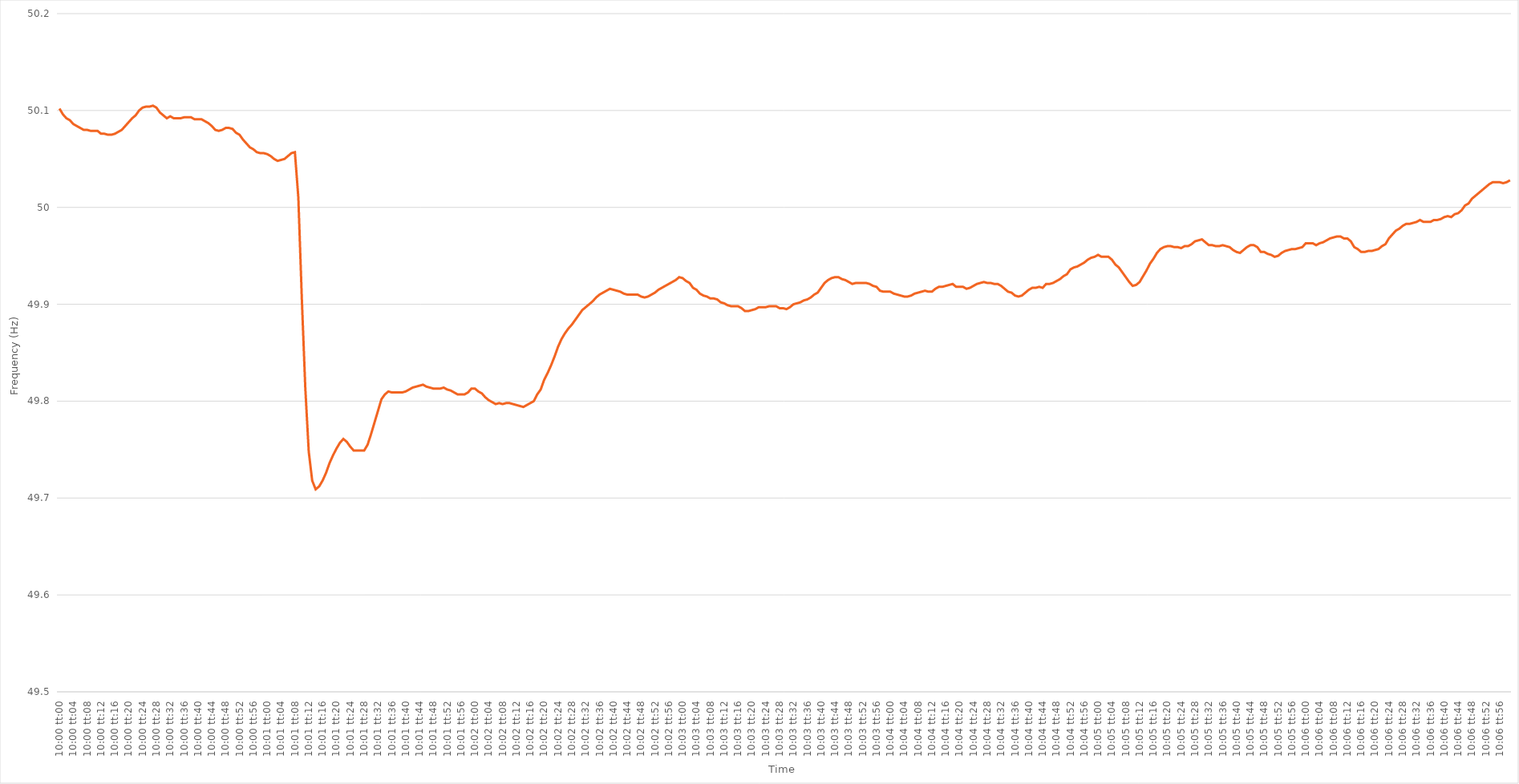
| Category | Series 0 |
|---|---|
| 0.4166666666666667 | 50.102 |
| 0.4166782407407407 | 50.096 |
| 0.4166898148148148 | 50.092 |
| 0.41670138888888886 | 50.09 |
| 0.41671296296296295 | 50.086 |
| 0.416724537037037 | 50.084 |
| 0.41673611111111114 | 50.082 |
| 0.4167476851851852 | 50.08 |
| 0.4167592592592593 | 50.08 |
| 0.4167708333333333 | 50.079 |
| 0.4167824074074074 | 50.079 |
| 0.41679398148148145 | 50.079 |
| 0.4168055555555556 | 50.076 |
| 0.41681712962962963 | 50.076 |
| 0.41682870370370373 | 50.075 |
| 0.41684027777777777 | 50.075 |
| 0.41685185185185186 | 50.076 |
| 0.4168634259259259 | 50.078 |
| 0.41687500000000005 | 50.08 |
| 0.4168865740740741 | 50.084 |
| 0.4168981481481482 | 50.088 |
| 0.4169097222222222 | 50.092 |
| 0.41692129629629626 | 50.095 |
| 0.41693287037037036 | 50.1 |
| 0.4169444444444444 | 50.103 |
| 0.41695601851851855 | 50.104 |
| 0.4169675925925926 | 50.104 |
| 0.4169791666666667 | 50.105 |
| 0.4169907407407407 | 50.103 |
| 0.4170023148148148 | 50.098 |
| 0.41701388888888885 | 50.095 |
| 0.417025462962963 | 50.092 |
| 0.41703703703703704 | 50.094 |
| 0.41704861111111113 | 50.092 |
| 0.4170601851851852 | 50.092 |
| 0.41707175925925927 | 50.092 |
| 0.4170833333333333 | 50.093 |
| 0.41709490740740746 | 50.093 |
| 0.4171064814814815 | 50.093 |
| 0.4171180555555556 | 50.091 |
| 0.41712962962962963 | 50.091 |
| 0.41714120370370367 | 50.091 |
| 0.41715277777777776 | 50.089 |
| 0.4171643518518518 | 50.087 |
| 0.41717592592592595 | 50.084 |
| 0.4171875 | 50.08 |
| 0.4171990740740741 | 50.079 |
| 0.4172106481481481 | 50.08 |
| 0.4172222222222222 | 50.082 |
| 0.41723379629629626 | 50.082 |
| 0.4172453703703704 | 50.081 |
| 0.41725694444444444 | 50.077 |
| 0.41726851851851854 | 50.075 |
| 0.4172800925925926 | 50.07 |
| 0.41729166666666667 | 50.066 |
| 0.4173032407407407 | 50.062 |
| 0.41731481481481486 | 50.06 |
| 0.4173263888888889 | 50.057 |
| 0.417337962962963 | 50.056 |
| 0.41734953703703703 | 50.056 |
| 0.4173611111111111 | 50.055 |
| 0.41737268518518517 | 50.053 |
| 0.4173842592592592 | 50.05 |
| 0.41739583333333335 | 50.048 |
| 0.4174074074074074 | 50.049 |
| 0.4174189814814815 | 50.05 |
| 0.4174305555555555 | 50.053 |
| 0.4174421296296296 | 50.056 |
| 0.41745370370370366 | 50.057 |
| 0.4174652777777778 | 50.01 |
| 0.41747685185185185 | 49.906 |
| 0.41748842592592594 | 49.814 |
| 0.4175 | 49.748 |
| 0.4175115740740741 | 49.718 |
| 0.4175231481481481 | 49.709 |
| 0.41753472222222227 | 49.712 |
| 0.4175462962962963 | 49.718 |
| 0.4175578703703704 | 49.726 |
| 0.41756944444444444 | 49.736 |
| 0.41758101851851853 | 49.744 |
| 0.41759259259259257 | 49.751 |
| 0.4176041666666667 | 49.757 |
| 0.41761574074074076 | 49.761 |
| 0.4176273148148148 | 49.758 |
| 0.4176388888888889 | 49.753 |
| 0.41765046296296293 | 49.749 |
| 0.417662037037037 | 49.749 |
| 0.41767361111111106 | 49.749 |
| 0.4176851851851852 | 49.749 |
| 0.41769675925925925 | 49.755 |
| 0.41770833333333335 | 49.766 |
| 0.4177199074074074 | 49.778 |
| 0.4177314814814815 | 49.79 |
| 0.4177430555555555 | 49.802 |
| 0.41775462962962967 | 49.807 |
| 0.4177662037037037 | 49.81 |
| 0.4177777777777778 | 49.809 |
| 0.41778935185185184 | 49.809 |
| 0.41780092592592594 | 49.809 |
| 0.4178125 | 49.809 |
| 0.4178240740740741 | 49.81 |
| 0.41783564814814816 | 49.812 |
| 0.41784722222222226 | 49.814 |
| 0.4178587962962963 | 49.815 |
| 0.41787037037037034 | 49.816 |
| 0.41788194444444443 | 49.817 |
| 0.41789351851851847 | 49.815 |
| 0.4179050925925926 | 49.814 |
| 0.41791666666666666 | 49.813 |
| 0.41792824074074075 | 49.813 |
| 0.4179398148148148 | 49.813 |
| 0.4179513888888889 | 49.814 |
| 0.4179629629629629 | 49.812 |
| 0.4179745370370371 | 49.811 |
| 0.4179861111111111 | 49.809 |
| 0.4179976851851852 | 49.807 |
| 0.41800925925925925 | 49.807 |
| 0.41802083333333334 | 49.807 |
| 0.4180324074074074 | 49.809 |
| 0.41804398148148153 | 49.813 |
| 0.41805555555555557 | 49.813 |
| 0.41806712962962966 | 49.81 |
| 0.4180787037037037 | 49.808 |
| 0.41809027777777774 | 49.804 |
| 0.41810185185185184 | 49.801 |
| 0.4181134259259259 | 49.799 |
| 0.418125 | 49.797 |
| 0.41813657407407406 | 49.798 |
| 0.41814814814814816 | 49.797 |
| 0.4181597222222222 | 49.798 |
| 0.4181712962962963 | 49.798 |
| 0.41818287037037033 | 49.797 |
| 0.4181944444444445 | 49.796 |
| 0.4182060185185185 | 49.795 |
| 0.4182175925925926 | 49.794 |
| 0.41822916666666665 | 49.796 |
| 0.41824074074074075 | 49.798 |
| 0.4182523148148148 | 49.8 |
| 0.41826388888888894 | 49.807 |
| 0.418275462962963 | 49.812 |
| 0.41828703703703707 | 49.822 |
| 0.4182986111111111 | 49.829 |
| 0.4183101851851852 | 49.837 |
| 0.41832175925925924 | 49.846 |
| 0.4183333333333333 | 49.856 |
| 0.41834490740740743 | 49.864 |
| 0.41835648148148147 | 49.87 |
| 0.41836805555555556 | 49.875 |
| 0.4183796296296296 | 49.879 |
| 0.4183912037037037 | 49.884 |
| 0.41840277777777773 | 49.889 |
| 0.4184143518518519 | 49.894 |
| 0.4184259259259259 | 49.897 |
| 0.4184375 | 49.9 |
| 0.41844907407407406 | 49.903 |
| 0.41846064814814815 | 49.907 |
| 0.4184722222222222 | 49.91 |
| 0.41848379629629634 | 49.912 |
| 0.4184953703703704 | 49.914 |
| 0.4185069444444445 | 49.916 |
| 0.4185185185185185 | 49.915 |
| 0.4185300925925926 | 49.914 |
| 0.41854166666666665 | 49.913 |
| 0.4185532407407408 | 49.911 |
| 0.41856481481481483 | 49.91 |
| 0.4185763888888889 | 49.91 |
| 0.41858796296296297 | 49.91 |
| 0.418599537037037 | 49.91 |
| 0.4186111111111111 | 49.908 |
| 0.41862268518518514 | 49.907 |
| 0.4186342592592593 | 49.908 |
| 0.41864583333333333 | 49.91 |
| 0.4186574074074074 | 49.912 |
| 0.41866898148148146 | 49.915 |
| 0.41868055555555556 | 49.917 |
| 0.4186921296296296 | 49.919 |
| 0.41870370370370374 | 49.921 |
| 0.4187152777777778 | 49.923 |
| 0.4187268518518519 | 49.925 |
| 0.4187384259259259 | 49.928 |
| 0.41875 | 49.927 |
| 0.41876157407407405 | 49.924 |
| 0.4187731481481482 | 49.922 |
| 0.41878472222222224 | 49.917 |
| 0.41879629629629633 | 49.915 |
| 0.41880787037037037 | 49.911 |
| 0.4188194444444444 | 49.909 |
| 0.4188310185185185 | 49.908 |
| 0.41884259259259254 | 49.906 |
| 0.4188541666666667 | 49.906 |
| 0.41886574074074073 | 49.905 |
| 0.4188773148148148 | 49.902 |
| 0.41888888888888887 | 49.901 |
| 0.41890046296296296 | 49.899 |
| 0.418912037037037 | 49.898 |
| 0.41892361111111115 | 49.898 |
| 0.4189351851851852 | 49.898 |
| 0.4189467592592593 | 49.896 |
| 0.4189583333333333 | 49.893 |
| 0.4189699074074074 | 49.893 |
| 0.41898148148148145 | 49.894 |
| 0.4189930555555556 | 49.895 |
| 0.41900462962962964 | 49.897 |
| 0.41901620370370374 | 49.897 |
| 0.4190277777777778 | 49.897 |
| 0.4190393518518518 | 49.898 |
| 0.4190509259259259 | 49.898 |
| 0.41906249999999995 | 49.898 |
| 0.4190740740740741 | 49.896 |
| 0.41908564814814814 | 49.896 |
| 0.41909722222222223 | 49.895 |
| 0.41910879629629627 | 49.897 |
| 0.41912037037037037 | 49.9 |
| 0.4191319444444444 | 49.901 |
| 0.41914351851851855 | 49.902 |
| 0.4191550925925926 | 49.904 |
| 0.4191666666666667 | 49.905 |
| 0.4191782407407407 | 49.907 |
| 0.4191898148148148 | 49.91 |
| 0.41920138888888886 | 49.912 |
| 0.419212962962963 | 49.917 |
| 0.41922453703703705 | 49.922 |
| 0.41923611111111114 | 49.925 |
| 0.4192476851851852 | 49.927 |
| 0.4192592592592593 | 49.928 |
| 0.4192708333333333 | 49.928 |
| 0.41928240740740735 | 49.926 |
| 0.4192939814814815 | 49.925 |
| 0.41930555555555554 | 49.923 |
| 0.41931712962962964 | 49.921 |
| 0.4193287037037037 | 49.922 |
| 0.41934027777777777 | 49.922 |
| 0.4193518518518518 | 49.922 |
| 0.41936342592592596 | 49.922 |
| 0.419375 | 49.921 |
| 0.4193865740740741 | 49.919 |
| 0.41939814814814813 | 49.918 |
| 0.4194097222222222 | 49.914 |
| 0.41942129629629626 | 49.913 |
| 0.4194328703703704 | 49.913 |
| 0.41944444444444445 | 49.913 |
| 0.41945601851851855 | 49.911 |
| 0.4194675925925926 | 49.91 |
| 0.4194791666666667 | 49.909 |
| 0.4194907407407407 | 49.908 |
| 0.41950231481481487 | 49.908 |
| 0.4195138888888889 | 49.909 |
| 0.41952546296296295 | 49.911 |
| 0.41953703703703704 | 49.912 |
| 0.4195486111111111 | 49.913 |
| 0.4195601851851852 | 49.914 |
| 0.4195717592592592 | 49.913 |
| 0.41958333333333336 | 49.913 |
| 0.4195949074074074 | 49.916 |
| 0.4196064814814815 | 49.918 |
| 0.41961805555555554 | 49.918 |
| 0.41962962962962963 | 49.919 |
| 0.41964120370370367 | 49.92 |
| 0.4196527777777778 | 49.921 |
| 0.41966435185185186 | 49.918 |
| 0.41967592592592595 | 49.918 |
| 0.4196875 | 49.918 |
| 0.4196990740740741 | 49.916 |
| 0.4197106481481481 | 49.917 |
| 0.4197222222222223 | 49.919 |
| 0.4197337962962963 | 49.921 |
| 0.41974537037037035 | 49.922 |
| 0.41975694444444445 | 49.923 |
| 0.4197685185185185 | 49.922 |
| 0.4197800925925926 | 49.922 |
| 0.4197916666666666 | 49.921 |
| 0.41980324074074077 | 49.921 |
| 0.4198148148148148 | 49.919 |
| 0.4198263888888889 | 49.916 |
| 0.41983796296296294 | 49.913 |
| 0.41984953703703703 | 49.912 |
| 0.4198611111111111 | 49.909 |
| 0.4198726851851852 | 49.908 |
| 0.41988425925925926 | 49.909 |
| 0.41989583333333336 | 49.912 |
| 0.4199074074074074 | 49.915 |
| 0.4199189814814815 | 49.917 |
| 0.41993055555555553 | 49.917 |
| 0.4199421296296297 | 49.918 |
| 0.4199537037037037 | 49.917 |
| 0.4199652777777778 | 49.921 |
| 0.41997685185185185 | 49.921 |
| 0.4199884259259259 | 49.922 |
| 0.42 | 49.924 |
| 0.420011574074074 | 49.926 |
| 0.4200231481481482 | 49.929 |
| 0.4200347222222222 | 49.931 |
| 0.4200462962962963 | 49.936 |
| 0.42005787037037035 | 49.938 |
| 0.42006944444444444 | 49.939 |
| 0.4200810185185185 | 49.941 |
| 0.42009259259259263 | 49.943 |
| 0.42010416666666667 | 49.946 |
| 0.42011574074074076 | 49.948 |
| 0.4201273148148148 | 49.949 |
| 0.4201388888888889 | 49.951 |
| 0.42015046296296293 | 49.949 |
| 0.4201620370370371 | 49.949 |
| 0.4201736111111111 | 49.949 |
| 0.4201851851851852 | 49.946 |
| 0.42019675925925926 | 49.941 |
| 0.42020833333333335 | 49.938 |
| 0.4202199074074074 | 49.933 |
| 0.42023148148148143 | 49.928 |
| 0.4202430555555556 | 49.923 |
| 0.4202546296296296 | 49.919 |
| 0.4202662037037037 | 49.92 |
| 0.42027777777777775 | 49.923 |
| 0.42028935185185184 | 49.929 |
| 0.4203009259259259 | 49.935 |
| 0.42031250000000003 | 49.942 |
| 0.42032407407407407 | 49.947 |
| 0.42033564814814817 | 49.953 |
| 0.4203472222222222 | 49.957 |
| 0.4203587962962963 | 49.959 |
| 0.42037037037037034 | 49.96 |
| 0.4203819444444445 | 49.96 |
| 0.4203935185185185 | 49.959 |
| 0.4204050925925926 | 49.959 |
| 0.42041666666666666 | 49.958 |
| 0.42042824074074076 | 49.96 |
| 0.4204398148148148 | 49.96 |
| 0.42045138888888894 | 49.962 |
| 0.420462962962963 | 49.965 |
| 0.420474537037037 | 49.966 |
| 0.4204861111111111 | 49.967 |
| 0.42049768518518515 | 49.964 |
| 0.42050925925925925 | 49.961 |
| 0.4205208333333333 | 49.961 |
| 0.42053240740740744 | 49.96 |
| 0.4205439814814815 | 49.96 |
| 0.42055555555555557 | 49.961 |
| 0.4205671296296296 | 49.96 |
| 0.4205787037037037 | 49.959 |
| 0.42059027777777774 | 49.956 |
| 0.4206018518518519 | 49.954 |
| 0.42061342592592593 | 49.953 |
| 0.420625 | 49.956 |
| 0.42063657407407407 | 49.959 |
| 0.42064814814814816 | 49.961 |
| 0.4206597222222222 | 49.961 |
| 0.42067129629629635 | 49.959 |
| 0.4206828703703704 | 49.954 |
| 0.4206944444444444 | 49.954 |
| 0.4207060185185185 | 49.952 |
| 0.42071759259259256 | 49.951 |
| 0.42072916666666665 | 49.949 |
| 0.4207407407407407 | 49.95 |
| 0.42075231481481484 | 49.953 |
| 0.4207638888888889 | 49.955 |
| 0.420775462962963 | 49.956 |
| 0.420787037037037 | 49.957 |
| 0.4207986111111111 | 49.957 |
| 0.42081018518518515 | 49.958 |
| 0.4208217592592593 | 49.959 |
| 0.42083333333333334 | 49.963 |
| 0.42084490740740743 | 49.963 |
| 0.42085648148148147 | 49.963 |
| 0.42086805555555556 | 49.961 |
| 0.4208796296296296 | 49.963 |
| 0.42089120370370375 | 49.964 |
| 0.4209027777777778 | 49.966 |
| 0.4209143518518519 | 49.968 |
| 0.4209259259259259 | 49.969 |
| 0.42093749999999996 | 49.97 |
| 0.42094907407407406 | 49.97 |
| 0.4209606481481481 | 49.968 |
| 0.42097222222222225 | 49.968 |
| 0.4209837962962963 | 49.965 |
| 0.4209953703703704 | 49.959 |
| 0.4210069444444444 | 49.957 |
| 0.4210185185185185 | 49.954 |
| 0.42103009259259255 | 49.954 |
| 0.4210416666666667 | 49.955 |
| 0.42105324074074074 | 49.955 |
| 0.42106481481481484 | 49.956 |
| 0.4210763888888889 | 49.957 |
| 0.42108796296296297 | 49.96 |
| 0.421099537037037 | 49.962 |
| 0.42111111111111116 | 49.968 |
| 0.4211226851851852 | 49.972 |
| 0.4211342592592593 | 49.976 |
| 0.42114583333333333 | 49.978 |
| 0.4211574074074074 | 49.981 |
| 0.42116898148148146 | 49.983 |
| 0.4211805555555555 | 49.983 |
| 0.42119212962962965 | 49.984 |
| 0.4212037037037037 | 49.985 |
| 0.4212152777777778 | 49.987 |
| 0.4212268518518518 | 49.985 |
| 0.4212384259259259 | 49.985 |
| 0.42124999999999996 | 49.985 |
| 0.4212615740740741 | 49.987 |
| 0.42127314814814815 | 49.987 |
| 0.42128472222222224 | 49.988 |
| 0.4212962962962963 | 49.99 |
| 0.4213078703703704 | 49.991 |
| 0.4213194444444444 | 49.99 |
| 0.42133101851851856 | 49.993 |
| 0.4213425925925926 | 49.994 |
| 0.4213541666666667 | 49.997 |
| 0.42136574074074074 | 50.002 |
| 0.42137731481481483 | 50.004 |
| 0.42138888888888887 | 50.009 |
| 0.421400462962963 | 50.012 |
| 0.42141203703703706 | 50.015 |
| 0.4214236111111111 | 50.018 |
| 0.4214351851851852 | 50.021 |
| 0.42144675925925923 | 50.024 |
| 0.4214583333333333 | 50.026 |
| 0.42146990740740736 | 50.026 |
| 0.4214814814814815 | 50.026 |
| 0.42149305555555555 | 50.025 |
| 0.42150462962962965 | 50.026 |
| 0.4215162037037037 | 50.028 |